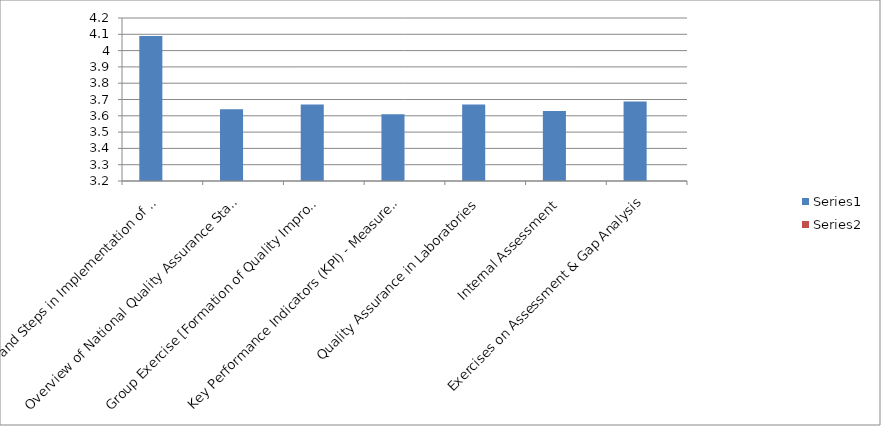
| Category | Series 0 | Series 1 |
|---|---|---|
| Principles and Steps in Implementation of Quality Assurance Programme | 4.09 |  |
| Overview of National Quality Assurance Standards and Measurement System | 3.64 |  |
| Group Exercise [Formation of Quality Improvement (QI) Team] | 3.67 |  |
| Key Performance Indicators (KPI) - Measurement & Analysis | 3.61 |  |
| Quality Assurance in Laboratories | 3.67 |  |
| Internal Assessment  | 3.63 |  |
| Exercises on Assessment & Gap Analysis | 3.688 |  |